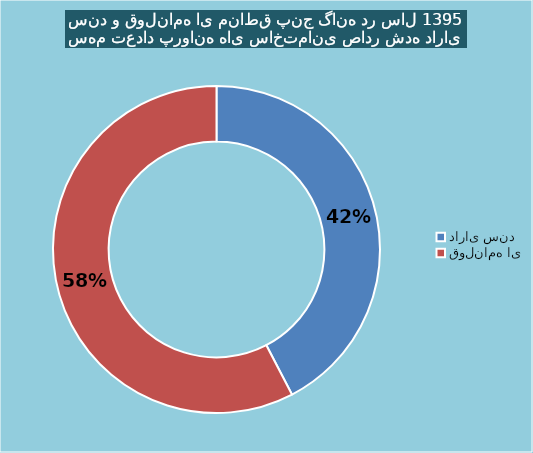
| Category | Series 0 |
|---|---|
| دارای سند | 710 |
| قولنامه ای | 966 |